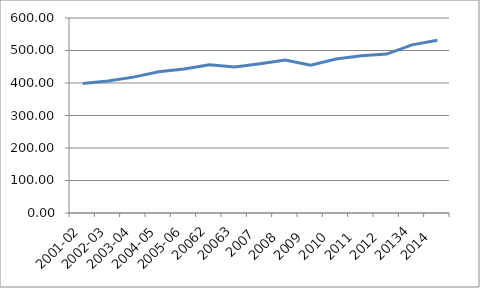
| Category | Series 0 |
|---|---|
| 2001-02 | 398.3 |
| 2002-03 | 406.2 |
| 2003-04 | 418.1 |
| 2004-05 | 434.4 |
| 2005-06 | 443.4 |
| 20062 | 455.9 |
| 20063 | 449 |
| 2007 | 459.2 |
| 2008  | 471 |
| 2009  | 455 |
| 2010  | 473.6 |
| 2011  | 483.6 |
| 2012  | 489 |
| 20134 | 517.3 |
| 2014  | 531.3 |